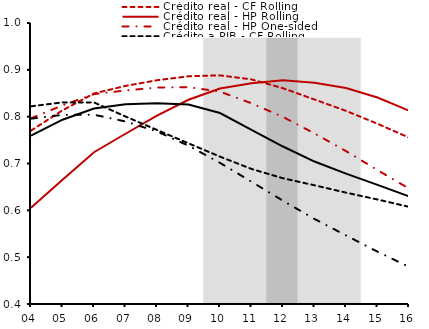
| Category | Mayor poder de predicción |
|---|---|
| 04 | 0 |
| 05 | 0 |
| 06 | 0 |
| 07 | 0 |
| 08 | 0 |
| 09 | 0 |
| 10 | 0.9 |
| 11 | 0.9 |
| 12 | 0.9 |
| 13 | 0.9 |
| 14 | 0.9 |
| 15 | 0 |
| 16 | 0 |